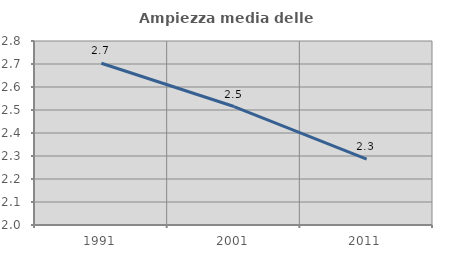
| Category | Ampiezza media delle famiglie |
|---|---|
| 1991.0 | 2.703 |
| 2001.0 | 2.515 |
| 2011.0 | 2.286 |